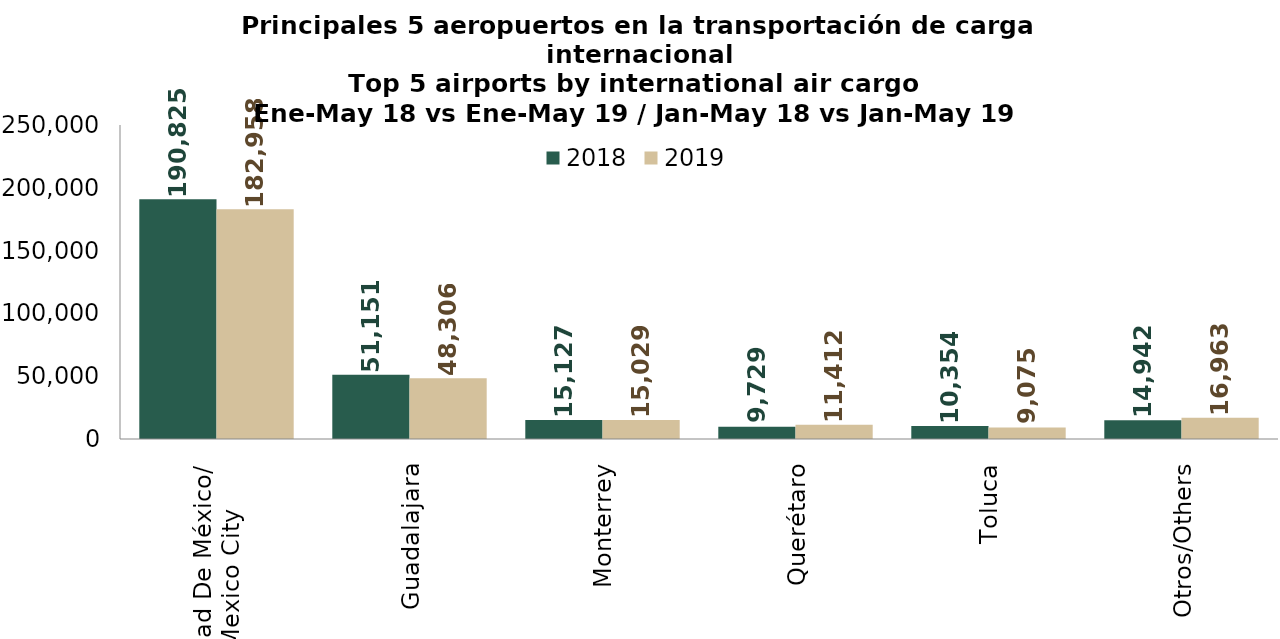
| Category | 2018 | 2019 |
|---|---|---|
| Ciudad De México/
Mexico City | 190824.58 | 182957.6 |
| Guadalajara | 51150.668 | 48305.9 |
| Monterrey | 15126.82 | 15029.277 |
| Querétaro | 9728.527 | 11411.885 |
| Toluca | 10353.569 | 9074.643 |
| Otros/Others | 14942.178 | 16963.251 |